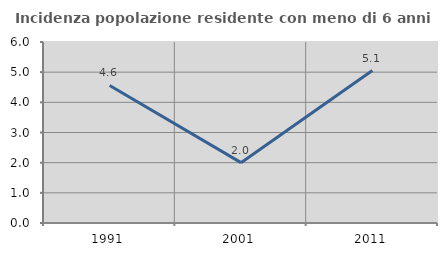
| Category | Incidenza popolazione residente con meno di 6 anni |
|---|---|
| 1991.0 | 4.559 |
| 2001.0 | 2 |
| 2011.0 | 5.054 |